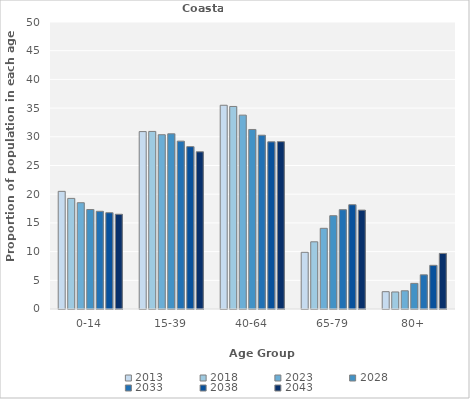
| Category | 2013 | 2018 | 2023 | 2028 | 2033 | 2038 | 2043 |
|---|---|---|---|---|---|---|---|
| 0-14 | 20.496 | 19.268 | 18.514 | 17.331 | 17.024 | 16.773 | 16.506 |
| 15-39 | 30.909 | 30.935 | 30.361 | 30.518 | 29.246 | 28.287 | 27.39 |
| 40-64 | 35.496 | 35.285 | 33.775 | 31.275 | 30.278 | 29.124 | 29.157 |
| 65-79 | 9.876 | 11.707 | 14.056 | 16.255 | 17.302 | 18.167 | 17.229 |
| 80+ | 3.017 | 2.967 | 3.173 | 4.462 | 5.952 | 7.61 | 9.679 |